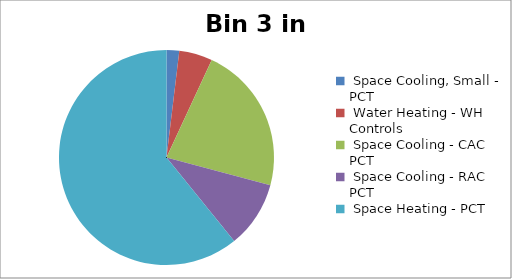
| Category | Series 0 |
|---|---|
|  Space Cooling, Small - PCT | 0.005 |
|  Water Heating - WH Controls | 0.014 |
|  Space Cooling - CAC PCT | 0.061 |
|  Space Cooling - RAC PCT | 0.027 |
|  Space Heating - PCT | 0.165 |